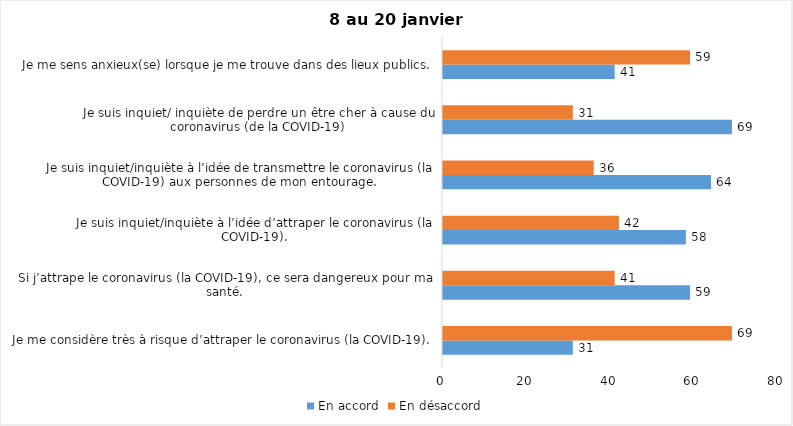
| Category | En accord | En désaccord |
|---|---|---|
| Je me considère très à risque d’attraper le coronavirus (la COVID-19). | 31 | 69 |
| Si j’attrape le coronavirus (la COVID-19), ce sera dangereux pour ma santé. | 59 | 41 |
| Je suis inquiet/inquiète à l’idée d’attraper le coronavirus (la COVID-19). | 58 | 42 |
| Je suis inquiet/inquiète à l’idée de transmettre le coronavirus (la COVID-19) aux personnes de mon entourage. | 64 | 36 |
| Je suis inquiet/ inquiète de perdre un être cher à cause du coronavirus (de la COVID-19) | 69 | 31 |
| Je me sens anxieux(se) lorsque je me trouve dans des lieux publics. | 41 | 59 |